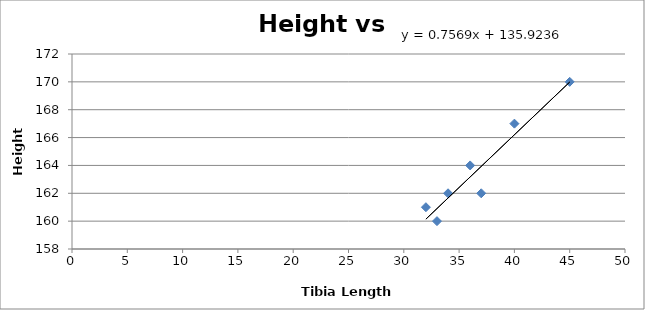
| Category | Series 0 |
|---|---|
| 32.0 | 161 |
| 33.0 | 160 |
| 40.0 | 167 |
| 34.0 | 162 |
| 45.0 | 170 |
| 36.0 | 164 |
| 37.0 | 162 |